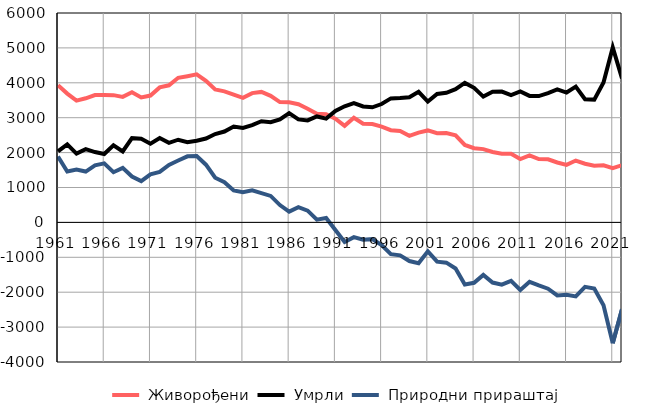
| Category |  Живорођени |  Умрли |  Природни прираштај |
|---|---|---|---|
| 1961.0 | 3928 | 2038 | 1890 |
| 1962.0 | 3691 | 2234 | 1457 |
| 1963.0 | 3489 | 1972 | 1517 |
| 1964.0 | 3556 | 2099 | 1457 |
| 1965.0 | 3648 | 2015 | 1633 |
| 1966.0 | 3649 | 1959 | 1690 |
| 1967.0 | 3646 | 2208 | 1438 |
| 1968.0 | 3597 | 2034 | 1563 |
| 1969.0 | 3727 | 2414 | 1313 |
| 1970.0 | 3580 | 2398 | 1182 |
| 1971.0 | 3635 | 2256 | 1379 |
| 1972.0 | 3868 | 2419 | 1449 |
| 1973.0 | 3928 | 2279 | 1649 |
| 1974.0 | 4143 | 2369 | 1774 |
| 1975.0 | 4189 | 2296 | 1893 |
| 1976.0 | 4241 | 2340 | 1901 |
| 1977.0 | 4056 | 2402 | 1654 |
| 1978.0 | 3810 | 2531 | 1279 |
| 1979.0 | 3756 | 2604 | 1152 |
| 1980.0 | 3662 | 2748 | 914 |
| 1981.0 | 3571 | 2707 | 864 |
| 1982.0 | 3705 | 2788 | 917 |
| 1983.0 | 3739 | 2899 | 840 |
| 1984.0 | 3628 | 2870 | 758 |
| 1985.0 | 3446 | 2949 | 497 |
| 1986.0 | 3440 | 3131 | 309 |
| 1987.0 | 3386 | 2951 | 435 |
| 1988.0 | 3258 | 2922 | 336 |
| 1989.0 | 3115 | 3036 | 79 |
| 1990.0 | 3099 | 2973 | 126 |
| 1991.0 | 2972 | 3191 | -219 |
| 1992.0 | 2766 | 3328 | -562 |
| 1993.0 | 2998 | 3420 | -422 |
| 1994.0 | 2827 | 3321 | -494 |
| 1995.0 | 2818 | 3298 | -480 |
| 1996.0 | 2745 | 3392 | -647 |
| 1997.0 | 2642 | 3553 | -911 |
| 1998.0 | 2618 | 3563 | -945 |
| 1999.0 | 2480 | 3587 | -1107 |
| 2000.0 | 2573 | 3743 | -1170 |
| 2001.0 | 2635 | 3463 | -828 |
| 2002.0 | 2554 | 3680 | -1126 |
| 2003.0 | 2562 | 3715 | -1153 |
| 2004.0 | 2497 | 3816 | -1319 |
| 2005.0 | 2220 | 3997 | -1777 |
| 2006.0 | 2126 | 3857 | -1731 |
| 2007.0 | 2100 | 3604 | -1504 |
| 2008.0 | 2018 | 3742 | -1724 |
| 2009.0 | 1967 | 3749 | -1782 |
| 2010.0 | 1968 | 3645 | -1677 |
| 2011.0 | 1814 | 3751 | -1937 |
| 2012.0 | 1920 | 3624 | -1704 |
| 2013.0 | 1813 | 3619 | -1806 |
| 2014.0 | 1807 | 3706 | -1899 |
| 2015.0 | 1716 | 3809 | -2093 |
| 2016.0 | 1647 | 3721 | -2074 |
| 2017.0 | 1772 | 3891 | -2119 |
| 2018.0 | 1682 | 3530 | -1848 |
| 2019.0 | 1625 | 3519 | -1894 |
| 2020.0 | 1637 | 4009 | -2372 |
| 2021.0 | 1554 | 5014 | -3460 |
| 2022.0 | 1639 | 4127 | -2488 |